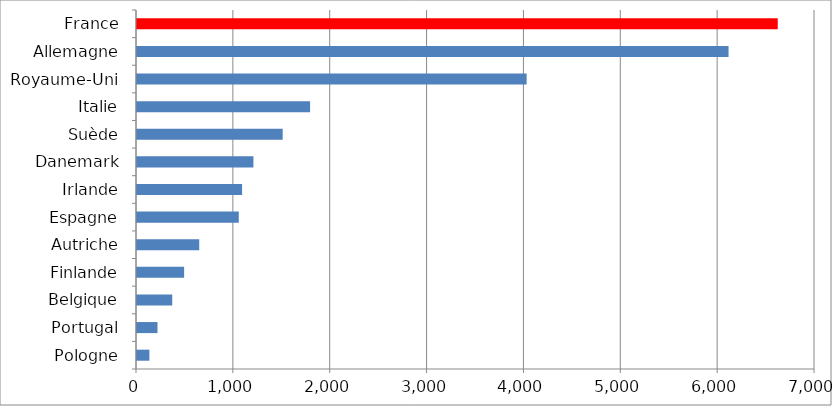
| Category | 2019 |
|---|---|
| Pologne | 127.807 |
| Portugal | 211.664 |
| Belgique | 363.709 |
| Finlande | 486.492 |
| Autriche | 642.476 |
| Espagne | 1051 |
| Irlande | 1085.011 |
| Danemark | 1202.029 |
| Suède | 1504.151 |
| Italie | 1786.907 |
| Royaume-Uni | 4022.789 |
| Allemagne | 6107.493 |
| France | 6615.316 |